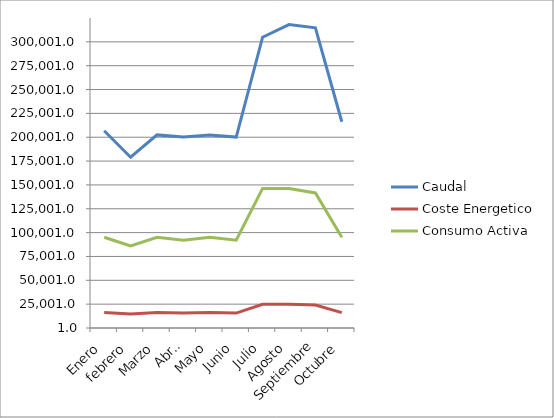
| Category | Caudal | Coste Energetico | Consumo Activa |
|---|---|---|---|
| Enero | 206823.913 | 16173.63 | 95139 |
| febrero | 179025 | 14608.44 | 85932 |
| Marzo | 202423.404 | 16173.63 | 95139 |
| Abril | 200152.174 | 15651.9 | 92070 |
| Mayo | 202423.404 | 16173.63 | 95139 |
| Junio | 200152.174 | 15651.9 | 92070 |
| Julio | 304846.25 | 24875.454 | 146326.2 |
| Agosto | 318100.435 | 24875.454 | 146326.2 |
| Septiembre | 314680 | 24073.02 | 141606 |
| Octubre | 216225 | 16173.63 | 95139 |